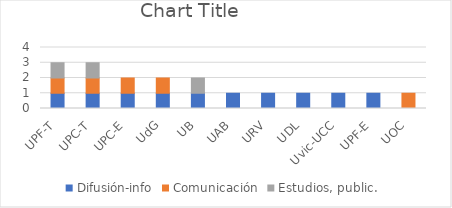
| Category | Difusión-info | Comunicación | Estudios, public.  |
|---|---|---|---|
| UPF-T | 1 | 1 | 1 |
| UPC-T | 1 | 1 | 1 |
| UPC-E | 1 | 1 | 0 |
| UdG | 1 | 1 | 0 |
| UB | 1 | 0 | 1 |
| UAB | 1 | 0 | 0 |
| URV | 1 | 0 | 0 |
| UDL | 1 | 0 | 0 |
| Uvic-UCC | 1 | 0 | 0 |
| UPF-E | 1 | 0 | 0 |
| UOC | 0 | 1 | 0 |